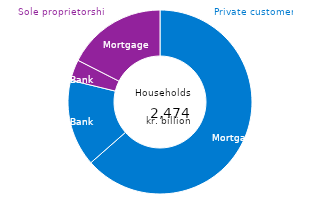
| Category | Loans |
|---|---|
| Private customers - Mortgage debt | 1571.705 |
| Private customers - Bank debt | 378.091 |
| Sole proprietorships - Mortgage debt | 90.904 |
| Sole proprietorships - Bank debt | 433.325 |